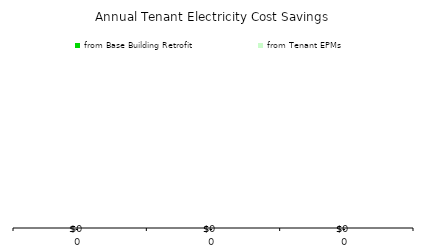
| Category | from Base Building Retrofit | from Tenant EPMs |
|---|---|---|
| 0.0 | 0 | 0 |
| 0.0 | 0 | 0 |
| 0.0 | 0 | 0 |